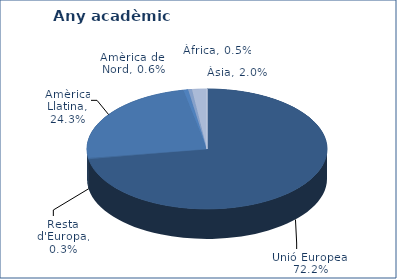
| Category | % |
|---|---|
| Unió Europea | 0.722 |
| Resta d'Europa | 0.003 |
| Amèrica Llatina | 0.243 |
| Amèrica del Nord | 0.006 |
| Àfrica | 0.005 |
| Àsia | 0.02 |
| Oceania | 0 |